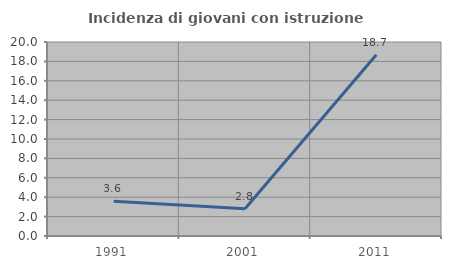
| Category | Incidenza di giovani con istruzione universitaria |
|---|---|
| 1991.0 | 3.571 |
| 2001.0 | 2.804 |
| 2011.0 | 18.692 |